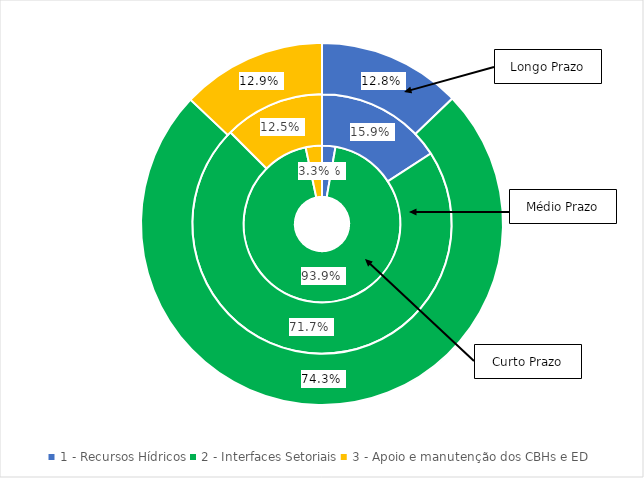
| Category | Curto Prazo (%) | Médio Prazo (%) | Longo Prazo (%) |
|---|---|---|---|
| 1 - Recursos Hídricos | 0.028 | 0.159 | 0.128 |
| 2 - Interfaces Setoriais | 0.939 | 0.717 | 0.743 |
| 3 - Apoio e manutenção dos CBHs e ED | 0.033 | 0.125 | 0.129 |